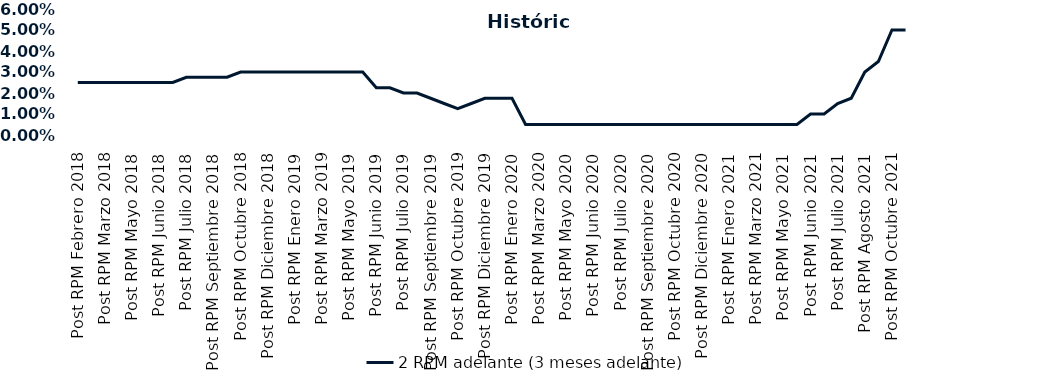
| Category | 2 RPM adelante (3 meses adelante) |
|---|---|
| Post RPM Febrero 2018 | 0.025 |
| Pre RPM Marzo 2018 | 0.025 |
| Post RPM Marzo 2018 | 0.025 |
| Pre RPM Mayo 2018 | 0.025 |
| Post RPM Mayo 2018 | 0.025 |
| Pre RPM Junio 2018 | 0.025 |
| Post RPM Junio 2018 | 0.025 |
| Pre RPM Julio 2018 | 0.025 |
| Post RPM Julio 2018 | 0.028 |
| Pre RPM Septiembre 2018 | 0.028 |
| Post RPM Septiembre 2018 | 0.028 |
| Pre RPM Octubre 2018 | 0.028 |
| Post RPM Octubre 2018 | 0.03 |
| Pre RPM Diciembre 2018 | 0.03 |
| Post RPM Diciembre 2018 | 0.03 |
| Pre RPM Enero 2019 | 0.03 |
| Post RPM Enero 2019 | 0.03 |
| Pre RPM Marzo 2019 | 0.03 |
| Post RPM Marzo 2019 | 0.03 |
| Pre RPM Mayo 2019 | 0.03 |
| Post RPM Mayo 2019 | 0.03 |
| Pre RPM Junio 2019 | 0.03 |
| Post RPM Junio 2019 | 0.022 |
| Pre RPM Julio 2019 | 0.022 |
| Post RPM Julio 2019 | 0.02 |
| Pre RPM Septiembre 2019 | 0.02 |
| Post RPM Septiembre 2019 | 0.018 |
| Pre RPM Octubre 2019 | 0.015 |
| Post RPM Octubre 2019 | 0.012 |
| Pre RPM Diciembre 2019 | 0.015 |
| Post RPM Diciembre 2019 | 0.018 |
| Pre RPM Enero 2020 | 0.018 |
| Post RPM Enero 2020 | 0.018 |
| Pre RPM Marzo 2020 | 0.005 |
| Post RPM Marzo 2020 | 0.005 |
| Pre RPM Mayo 2020 | 0.005 |
| Post RPM Mayo 2020 | 0.005 |
| Pre RPM Junio 2020 | 0.005 |
| Post RPM Junio 2020 | 0.005 |
| Pre RPM Julio 2020 | 0.005 |
| Post RPM Julio 2020 | 0.005 |
| Pre RPM Septiembre 2020 | 0.005 |
| Post RPM Septiembre 2020 | 0.005 |
| Pre RPM Octubre 2020 | 0.005 |
| Post RPM Octubre 2020 | 0.005 |
| Pre RPM Diciembre 2020 | 0.005 |
| Post RPM Diciembre 2020 | 0.005 |
| Pre RPM Enero 2021 | 0.005 |
| Post RPM Enero 2021 | 0.005 |
| Pre RPM Marzo 2021 | 0.005 |
| Post RPM Marzo 2021 | 0.005 |
| Pre RPM Mayo 2021 | 0.005 |
| Post RPM Mayo 2021 | 0.005 |
| Pre RPM Junio 2021 | 0.005 |
| Post RPM Junio 2021 | 0.01 |
| Pre RPM Julio 2021 | 0.01 |
| Post RPM Julio 2021 | 0.015 |
| Pre RPM Agosto 2021 | 0.018 |
| Post RPM Agosto 2021 | 0.03 |
| Pre RPM Octubre 2021 | 0.035 |
| Post RPM Octubre 2021 | 0.05 |
| Pre RPM Diciembre 2021 | 0.05 |